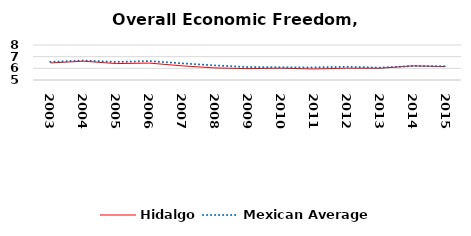
| Category | Hidalgo | Mexican Average  |
|---|---|---|
| 2003.0 | 6.463 | 6.552 |
| 2004.0 | 6.614 | 6.668 |
| 2005.0 | 6.409 | 6.546 |
| 2006.0 | 6.45 | 6.619 |
| 2007.0 | 6.214 | 6.428 |
| 2008.0 | 6.032 | 6.248 |
| 2009.0 | 5.974 | 6.106 |
| 2010.0 | 6.012 | 6.086 |
| 2011.0 | 5.946 | 6.074 |
| 2012.0 | 6.012 | 6.134 |
| 2013.0 | 6.005 | 6.054 |
| 2014.0 | 6.211 | 6.2 |
| 2015.0 | 6.151 | 6.174 |